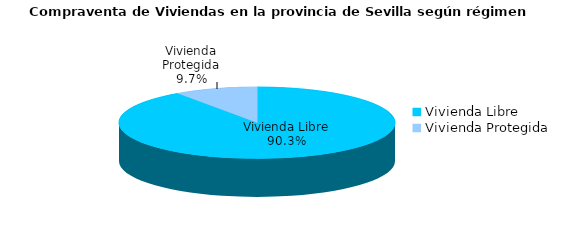
| Category | Series 0 | Series 1 |
|---|---|---|
| Vivienda Libre | 873 | 0.903 |
| Vivienda Protegida | 94 | 0.097 |